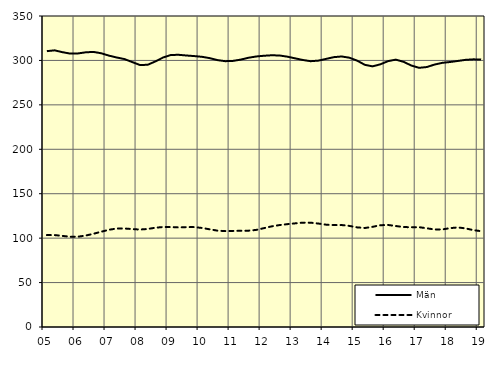
| Category | Män | Kvinnor |
|---|---|---|
| 5.0 | 310.44 | 103.45 |
| nan | 311.36 | 103.46 |
| 6.0 | 309.3 | 102.51 |
| 6.0 | 307.69 | 101.54 |
| 6.0 | 307.85 | 101.62 |
| nan | 309.12 | 102.88 |
| 7.0 | 309.6 | 104.88 |
| 7.0 | 308.08 | 107.22 |
| 7.0 | 305.41 | 109.41 |
| nan | 303.32 | 110.82 |
| 8.0 | 301.53 | 110.89 |
| 8.0 | 298.18 | 110.18 |
| 8.0 | 294.85 | 109.68 |
| nan | 295.08 | 110.33 |
| 9.0 | 298.93 | 111.73 |
| 9.0 | 303.34 | 112.55 |
| 9.0 | 306.14 | 112.45 |
| nan | 306.32 | 112.07 |
| 10.0 | 305.54 | 112.42 |
| 10.0 | 304.9 | 112.43 |
| 10.0 | 304.07 | 111.47 |
| nan | 302.59 | 109.93 |
| 11.0 | 300.36 | 108.41 |
| 11.0 | 299.16 | 107.96 |
| 11.0 | 299.47 | 108.11 |
| nan | 300.93 | 108.27 |
| 12.0 | 303.02 | 108.42 |
| 12.0 | 304.45 | 109.25 |
| 12.0 | 305.27 | 111.26 |
| nan | 305.8 | 113.29 |
| 13.0 | 305.57 | 114.7 |
| 13.0 | 304.25 | 115.73 |
| 13.0 | 302.38 | 116.61 |
| nan | 300.51 | 117.4 |
| 14.0 | 299.14 | 117.42 |
| 14.0 | 299.76 | 116.44 |
| 14.0 | 301.72 | 115.16 |
| nan | 303.68 | 114.72 |
| 15.0 | 304.46 | 114.76 |
| 15.0 | 303.09 | 113.78 |
| 15.0 | 299.81 | 112.12 |
| nan | 295.08 | 111.42 |
| 16.0 | 293.32 | 112.72 |
| 16.0 | 295.6 | 114.56 |
| 16.0 | 299.22 | 114.83 |
| nan | 300.9 | 113.64 |
| 17.0 | 298.42 | 112.49 |
| 17.0 | 294.26 | 112.29 |
| 17.0 | 291.69 | 112.31 |
| nan | 292.55 | 111.1 |
| 18.0 | 295.37 | 109.73 |
| 18.0 | 297.29 | 109.81 |
| 18.0 | 298.24 | 111.25 |
| nan | 299.41 | 112.08 |
| 19.0 | 300.66 | 110.94 |
| 19.0 | 301.22 | 109.03 |
| 19.0 | 301.04 | 107.83 |